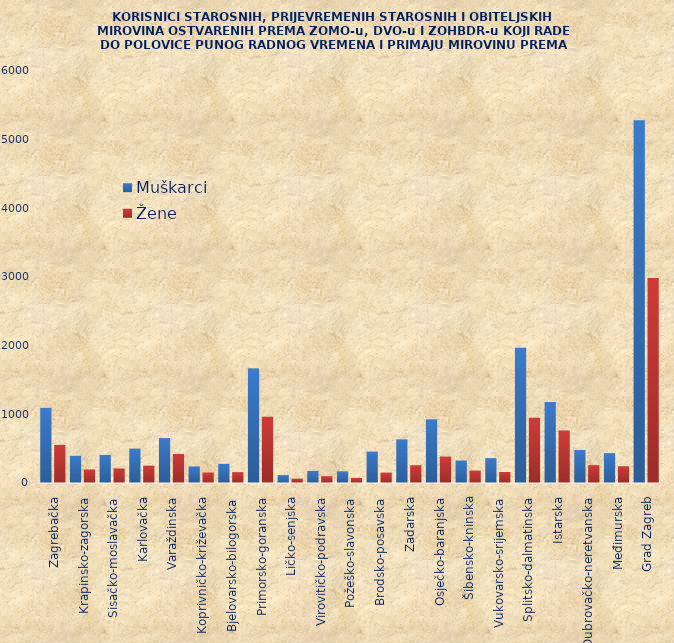
| Category | Muškarci | Žene |
|---|---|---|
| Zagrebačka | 1094 | 555 |
| Krapinsko-zagorska | 395 | 197 |
| Sisačko-moslavačka | 409 | 211 |
| Karlovačka | 500 | 252 |
| Varaždinska | 654 | 423 |
| Koprivničko-križevačka | 241 | 153 |
| Bjelovarsko-bilogorska | 279 | 158 |
| Primorsko-goranska | 1666 | 965 |
| Ličko-senjska | 115 | 63 |
| Virovitičko-podravska | 176 | 99 |
| Požeško-slavonska | 170 | 74 |
| Brodsko-posavska | 456 | 151 |
| Zadarska | 635 | 259 |
| Osječko-baranjska | 927 | 384 |
| Šibensko-kninska | 326 | 180 |
| Vukovarsko-srijemska | 362 | 160 |
| Splitsko-dalmatinska | 1968 | 949 |
| Istarska | 1180 | 765 |
| Dubrovačko-neretvanska | 480 | 260 |
| Međimurska | 435 | 244 |
| Grad Zagreb | 5282 | 2984 |